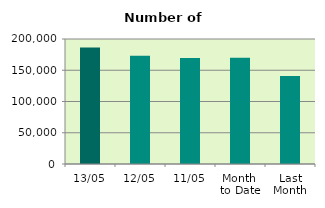
| Category | Series 0 |
|---|---|
| 13/05 | 186478 |
| 12/05 | 173166 |
| 11/05 | 169502 |
| Month 
to Date | 170035.4 |
| Last
Month | 140978.316 |